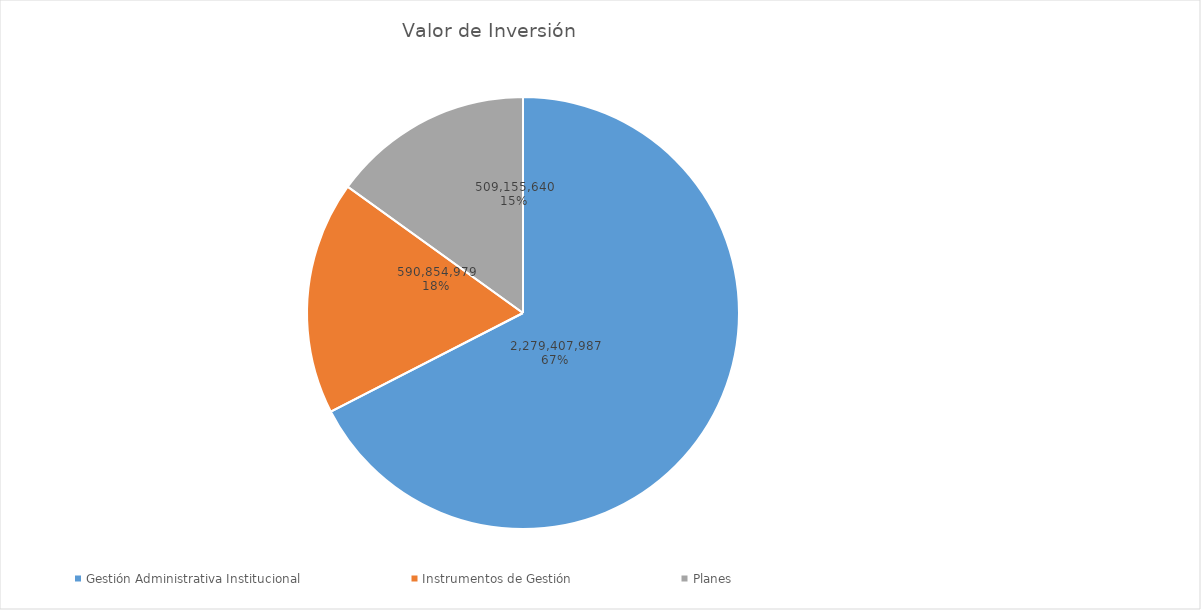
| Category | Valor de Inversión | Porcentaje de Ejecución dentro de la Actividad |
|---|---|---|
| Gestión Administrativa Institucional | 2279407987 | 7 |
| Instrumentos de Gestión | 590854979 | 2 |
| Planes | 509155640 | 5 |